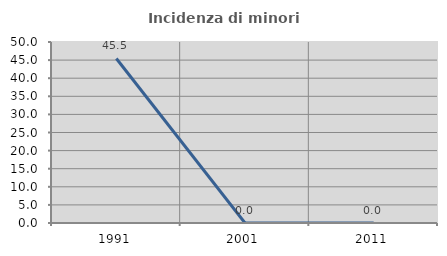
| Category | Incidenza di minori stranieri |
|---|---|
| 1991.0 | 45.455 |
| 2001.0 | 0 |
| 2011.0 | 0 |